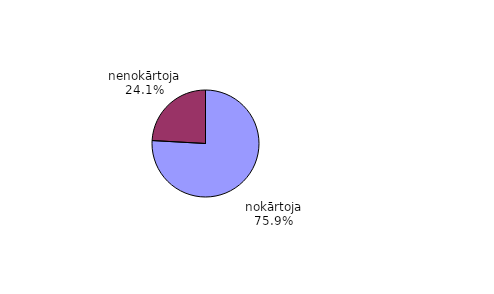
| Category | Series 0 |
|---|---|
| nokārtoja | 0.759 |
| nenokārtoja | 0.241 |